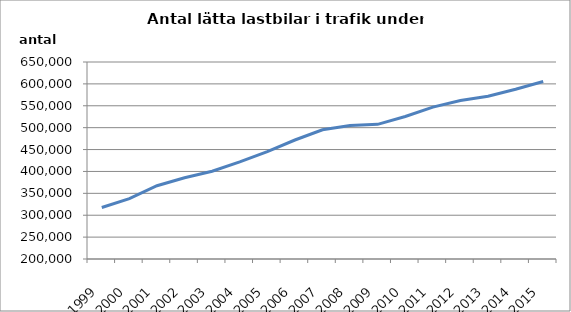
| Category | Series 0 |
|---|---|
| 1999.0 | 317665 |
| 2000.0 | 337939 |
| 2001.0 | 367472 |
| 2002.0 | 385708 |
| 2003.0 | 400511 |
| 2004.0 | 421708 |
| 2005.0 | 445394 |
| 2006.0 | 471809 |
| 2007.0 | 495214 |
| 2008.0 | 504850 |
| 2009.0 | 507566 |
| 2010.0 | 525547 |
| 2011.0 | 547033 |
| 2012.0 | 561948 |
| 2013.0 | 571800 |
| 2014.0 | 587802 |
| 2015.0 | 605470 |